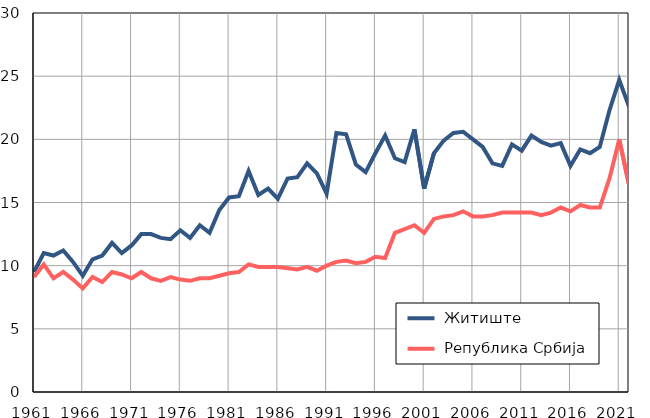
| Category |  Житиште |  Република Србија |
|---|---|---|
| 1961.0 | 9.5 | 9.1 |
| 1962.0 | 11 | 10.1 |
| 1963.0 | 10.8 | 9 |
| 1964.0 | 11.2 | 9.5 |
| 1965.0 | 10.3 | 8.9 |
| 1966.0 | 9.2 | 8.2 |
| 1967.0 | 10.5 | 9.1 |
| 1968.0 | 10.8 | 8.7 |
| 1969.0 | 11.8 | 9.5 |
| 1970.0 | 11 | 9.3 |
| 1971.0 | 11.6 | 9 |
| 1972.0 | 12.5 | 9.5 |
| 1973.0 | 12.5 | 9 |
| 1974.0 | 12.2 | 8.8 |
| 1975.0 | 12.1 | 9.1 |
| 1976.0 | 12.8 | 8.9 |
| 1977.0 | 12.2 | 8.8 |
| 1978.0 | 13.2 | 9 |
| 1979.0 | 12.6 | 9 |
| 1980.0 | 14.4 | 9.2 |
| 1981.0 | 15.4 | 9.4 |
| 1982.0 | 15.5 | 9.5 |
| 1983.0 | 17.5 | 10.1 |
| 1984.0 | 15.6 | 9.9 |
| 1985.0 | 16.1 | 9.9 |
| 1986.0 | 15.3 | 9.9 |
| 1987.0 | 16.9 | 9.8 |
| 1988.0 | 17 | 9.7 |
| 1989.0 | 18.1 | 9.9 |
| 1990.0 | 17.3 | 9.6 |
| 1991.0 | 15.7 | 10 |
| 1992.0 | 20.5 | 10.3 |
| 1993.0 | 20.4 | 10.4 |
| 1994.0 | 18 | 10.2 |
| 1995.0 | 17.4 | 10.3 |
| 1996.0 | 18.9 | 10.7 |
| 1997.0 | 20.3 | 10.6 |
| 1998.0 | 18.5 | 12.6 |
| 1999.0 | 18.2 | 12.9 |
| 2000.0 | 20.8 | 13.2 |
| 2001.0 | 16.1 | 12.6 |
| 2002.0 | 18.9 | 13.7 |
| 2003.0 | 19.9 | 13.9 |
| 2004.0 | 20.5 | 14 |
| 2005.0 | 20.6 | 14.3 |
| 2006.0 | 20 | 13.9 |
| 2007.0 | 19.4 | 13.9 |
| 2008.0 | 18.1 | 14 |
| 2009.0 | 17.9 | 14.2 |
| 2010.0 | 19.6 | 14.2 |
| 2011.0 | 19.1 | 14.2 |
| 2012.0 | 20.3 | 14.2 |
| 2013.0 | 19.8 | 14 |
| 2014.0 | 19.5 | 14.2 |
| 2015.0 | 19.7 | 14.6 |
| 2016.0 | 17.9 | 14.3 |
| 2017.0 | 19.2 | 14.8 |
| 2018.0 | 18.9 | 14.6 |
| 2019.0 | 19.4 | 14.6 |
| 2020.0 | 22.3 | 16.9 |
| 2021.0 | 24.7 | 20 |
| 2022.0 | 22.6 | 16.4 |